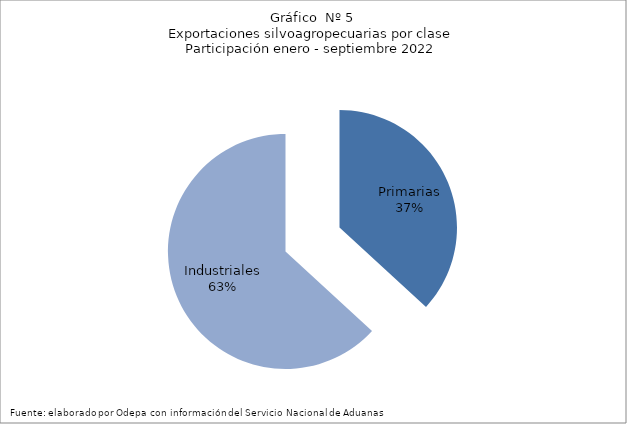
| Category | Series 0 |
|---|---|
| Primarias | 5393231 |
| Industriales | 9251038 |